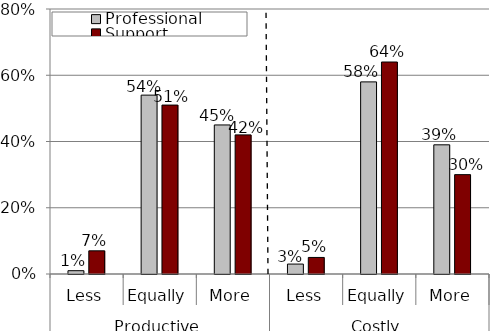
| Category | Professional | Support |
|---|---|---|
| 0 | 0.01 | 0.07 |
| 1 | 0.54 | 0.51 |
| 2 | 0.45 | 0.42 |
| 3 | 0.03 | 0.05 |
| 4 | 0.58 | 0.64 |
| 5 | 0.39 | 0.3 |